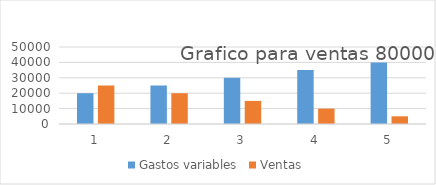
| Category | Gastos variables | Ventas |
|---|---|---|
| 0 | 20000 | 25000 |
| 1 | 25000 | 20000 |
| 2 | 30000 | 15000 |
| 3 | 35000 | 10000 |
| 4 | 40000 | 5000 |